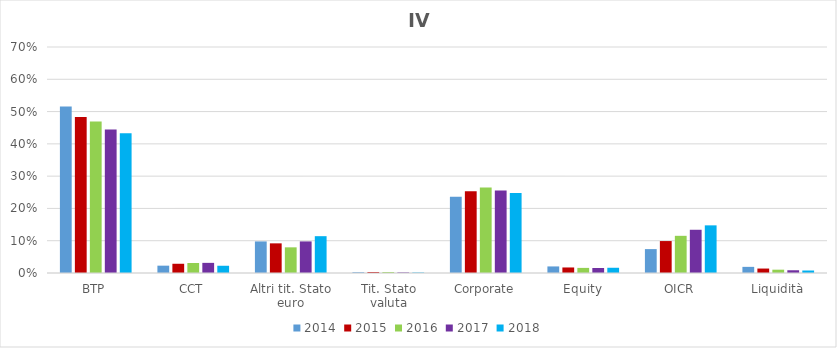
| Category | 2014 | 2015 | 2016 | 2017 | 2018 |
|---|---|---|---|---|---|
| BTP | 0.515 | 0.483 | 0.469 | 0.444 | 0.433 |
| CCT | 0.023 | 0.029 | 0.031 | 0.031 | 0.022 |
| Altri tit. Stato euro | 0.098 | 0.092 | 0.079 | 0.098 | 0.114 |
| Tit. Stato valuta | 0.002 | 0.003 | 0.003 | 0.002 | 0.001 |
| Corporate | 0.236 | 0.253 | 0.265 | 0.255 | 0.248 |
| Equity | 0.02 | 0.017 | 0.016 | 0.015 | 0.016 |
| OICR | 0.074 | 0.099 | 0.115 | 0.134 | 0.148 |
| Liquidità | 0.019 | 0.014 | 0.01 | 0.008 | 0.008 |